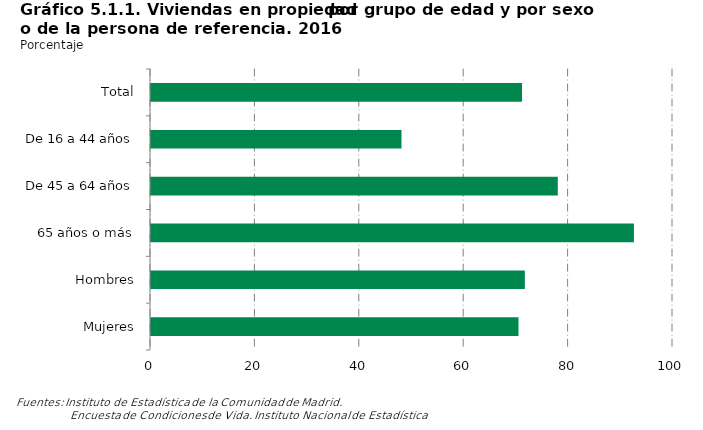
| Category | Series 0 |
|---|---|
|    Total | 71.08 |
|    De 16 a 44 años | 47.986 |
|    De 45 a 64 años | 77.931 |
|    65 años o más | 92.511 |
| Hombres | 71.617 |
| Mujeres | 70.399 |